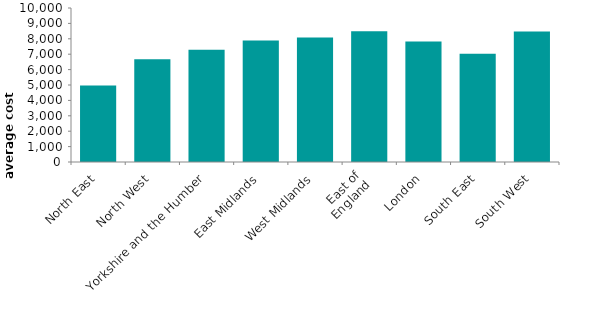
| Category | Series 0 |
|---|---|
| North East | 4973.323 |
| North West | 6675.572 |
| Yorkshire and the Humber | 7288.797 |
| East Midlands | 7888.538 |
| West Midlands | 8087.016 |
| East of
England | 8482.488 |
| London | 7826.423 |
| South East | 7029.392 |
| South West | 8481.051 |